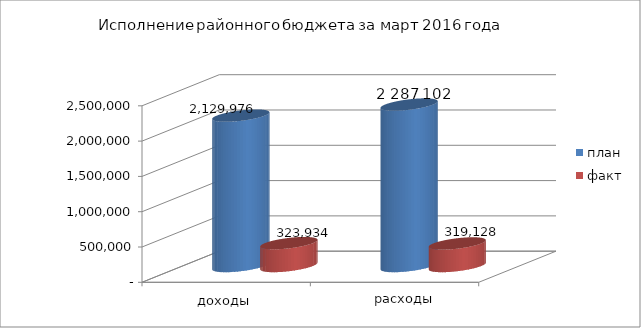
| Category | план | факт |
|---|---|---|
| 0 | 2129976 | 323934 |
| 1 | 2287102 | 319128 |